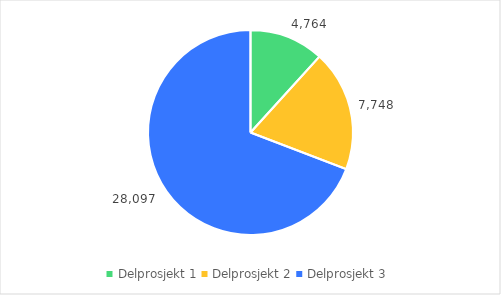
| Category | Series 0 |
|---|---|
| Delprosjekt 1 | 4764.488 |
| Delprosjekt 2 | 7748.401 |
| Delprosjekt 3 | 28096.848 |